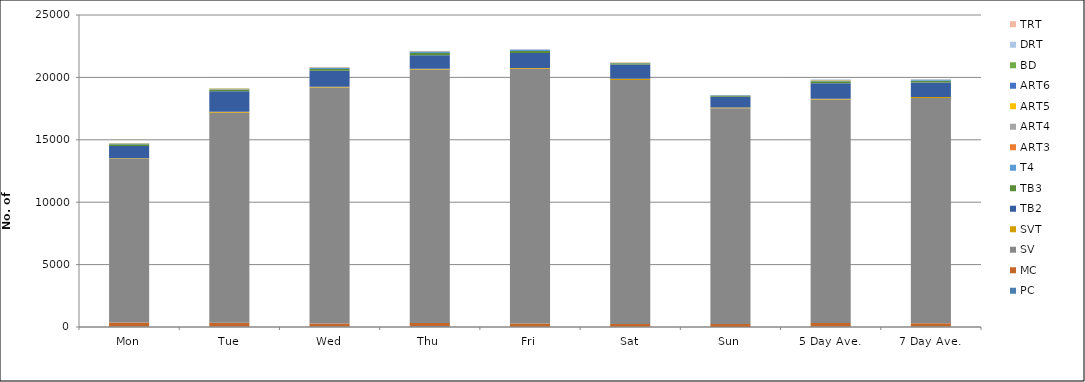
| Category | PC | MC | SV | SVT | TB2 | TB3 | T4 | ART3 | ART4 | ART5 | ART6 | BD | DRT | TRT |
|---|---|---|---|---|---|---|---|---|---|---|---|---|---|---|
| Mon | 48 | 321 | 13118 | 26 | 983 | 147 | 55 | 9 | 18 | 9 | 15 | 0 | 0 | 0 |
| Tue | 43 | 301 | 16819 | 91 | 1635 | 119 | 52 | 12 | 17 | 13 | 17 | 2 | 2 | 1 |
| Wed | 48 | 237 | 18900 | 63 | 1283 | 148 | 76 | 10 | 17 | 13 | 17 | 0 | 0 | 0 |
| Thu | 53 | 270 | 20301 | 62 | 1084 | 191 | 94 | 5 | 12 | 14 | 22 | 3 | 2 | 0 |
| Fri | 29 | 254 | 20413 | 62 | 1204 | 163 | 66 | 7 | 14 | 11 | 10 | 1 | 1 | 0 |
| Sat | 18 | 228 | 19551 | 99 | 1142 | 88 | 40 | 7 | 5 | 10 | 10 | 0 | 4 | 2 |
| Sun | 10 | 236 | 17283 | 64 | 850 | 84 | 26 | 5 | 11 | 7 | 17 | 0 | 1 | 0 |
| 5 Day Ave. | 44 | 277 | 17910 | 61 | 1238 | 154 | 69 | 9 | 16 | 12 | 16 | 1 | 1 | 0 |
| 7 Day Ave. | 36 | 264 | 18055 | 67 | 1169 | 134 | 58 | 8 | 13 | 11 | 15 | 1 | 1 | 0 |